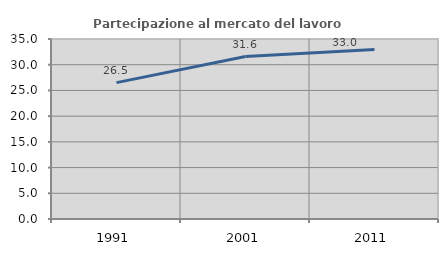
| Category | Partecipazione al mercato del lavoro  femminile |
|---|---|
| 1991.0 | 26.515 |
| 2001.0 | 31.579 |
| 2011.0 | 32.967 |